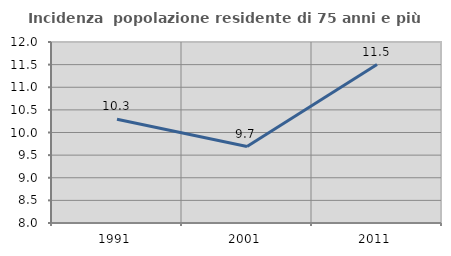
| Category | Incidenza  popolazione residente di 75 anni e più |
|---|---|
| 1991.0 | 10.292 |
| 2001.0 | 9.69 |
| 2011.0 | 11.501 |